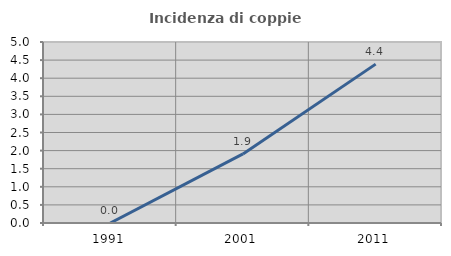
| Category | Incidenza di coppie miste |
|---|---|
| 1991.0 | 0 |
| 2001.0 | 1.908 |
| 2011.0 | 4.389 |